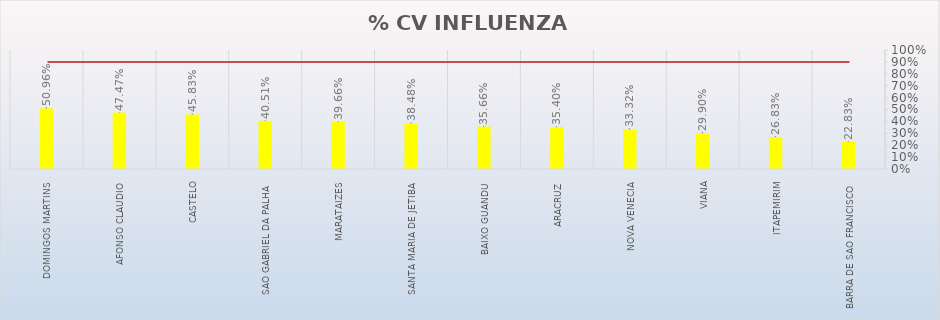
| Category | % CV INFLUENZA |
|---|---|
| DOMINGOS MARTINS | 0.51 |
| AFONSO CLAUDIO | 0.475 |
| CASTELO | 0.458 |
| SAO GABRIEL DA PALHA | 0.405 |
| MARATAIZES | 0.397 |
| SANTA MARIA DE JETIBA | 0.385 |
| BAIXO GUANDU | 0.357 |
| ARACRUZ | 0.354 |
| NOVA VENECIA | 0.333 |
| VIANA | 0.299 |
| ITAPEMIRIM | 0.268 |
| BARRA DE SAO FRANCISCO | 0.228 |